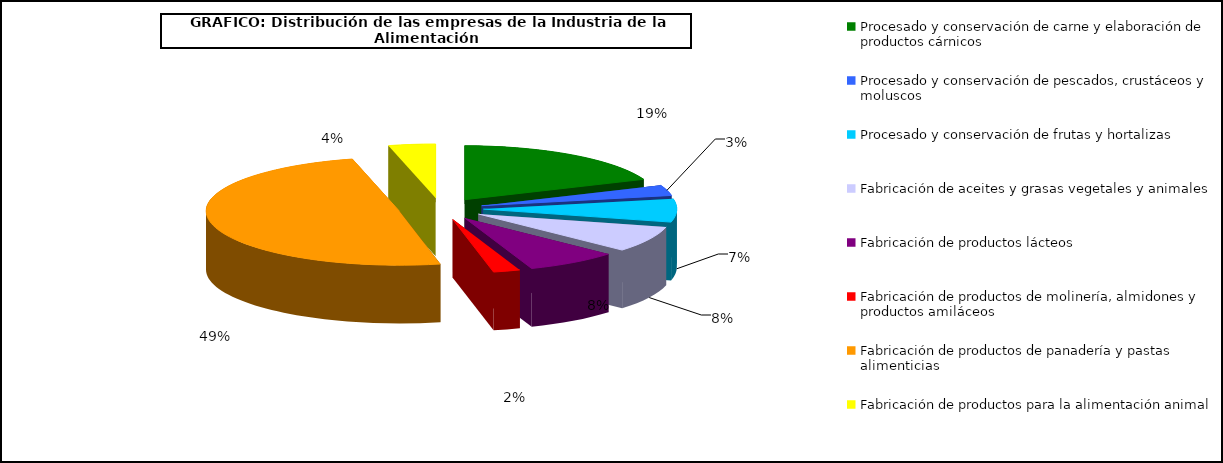
| Category | Series 0 |
|---|---|
| Procesado y conservación de carne y elaboración de productos cárnicos | 3810 |
| Procesado y conservación de pescados, crustáceos y moluscos | 632 |
| Procesado y conservación de frutas y hortalizas | 1401 |
| Fabricación de aceites y grasas vegetales y animales | 1577 |
| Fabricación de productos lácteos | 1558 |
| Fabricación de productos de molinería, almidones y productos amiláceos | 454 |
| Fabricación de productos de panadería y pastas alimenticias | 10009 |
| Fabricación de productos para la alimentación animal | 793 |